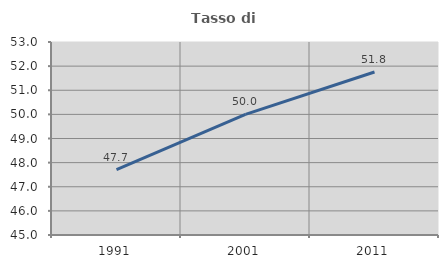
| Category | Tasso di occupazione   |
|---|---|
| 1991.0 | 47.708 |
| 2001.0 | 50 |
| 2011.0 | 51.756 |